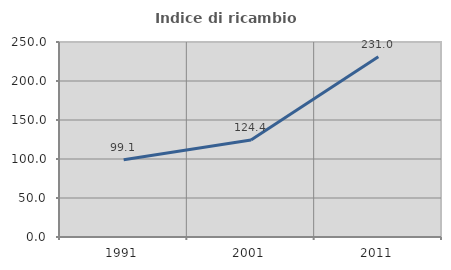
| Category | Indice di ricambio occupazionale  |
|---|---|
| 1991.0 | 99.118 |
| 2001.0 | 124.432 |
| 2011.0 | 231.002 |